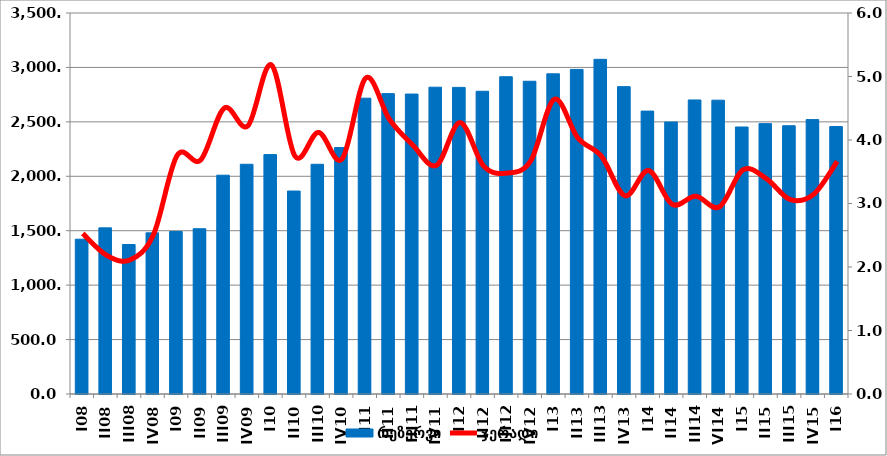
| Category | რეზერვი |
|---|---|
| I08 | 1421.92 |
| II08 | 1526.135 |
| III08 | 1373.33 |
| IV08 | 1480.158 |
| I09 | 1493.108 |
| II09 | 1518.204 |
| III09 | 2009.956 |
| IV09 | 2110.413 |
| I10 | 2199.234 |
| II10 | 1864.409 |
| III10 | 2110.241 |
| IV10 | 2263.931 |
| I11 | 2717.701 |
| II11 | 2759.254 |
| III11 | 2755.212 |
| IV11 | 2818.259 |
| I12 | 2816.705 |
| II12 | 2780.985 |
| III12 | 2914.659 |
| IV12 | 2872.974 |
| I13 | 2941.281 |
| II13 | 2981.697 |
| III13 | 3074.514 |
| IV13 | 2823.422 |
| I14 | 2598.611 |
| II14 | 2498.141 |
| III14 | 2701.162 |
| VI14 | 2699.188 |
| I15 | 2452.88 |
| II15 | 2483.75 |
| III15 | 2464.306 |
| IV15 | 2520.576 |
| I16 | 2456.679 |